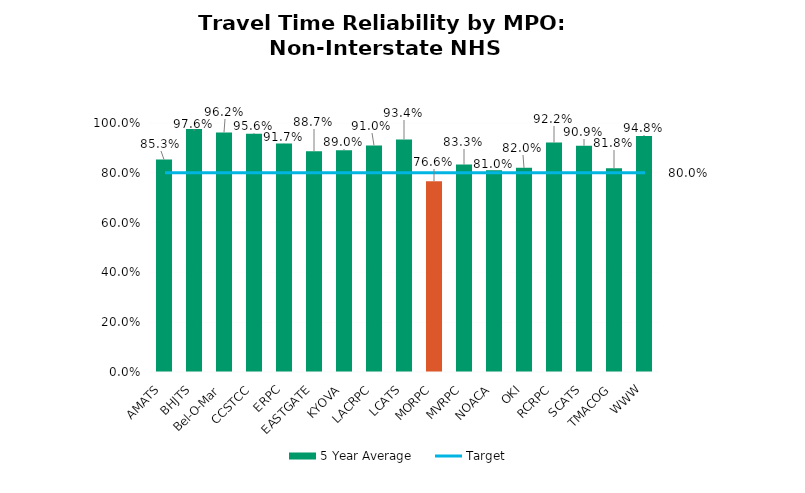
| Category | 5 Year Average |
|---|---|
| AMATS | 0.853 |
| BHJTS | 0.976 |
| Bel-O-Mar | 0.962 |
| CCSTCC | 0.956 |
| ERPC | 0.917 |
| EASTGATE | 0.887 |
| KYOVA | 0.89 |
| LACRPC | 0.91 |
| LCATS | 0.934 |
| MORPC | 0.766 |
| MVRPC | 0.833 |
| NOACA | 0.81 |
| OKI | 0.82 |
| RCRPC | 0.922 |
| SCATS | 0.909 |
| TMACOG | 0.818 |
| WWW | 0.948 |